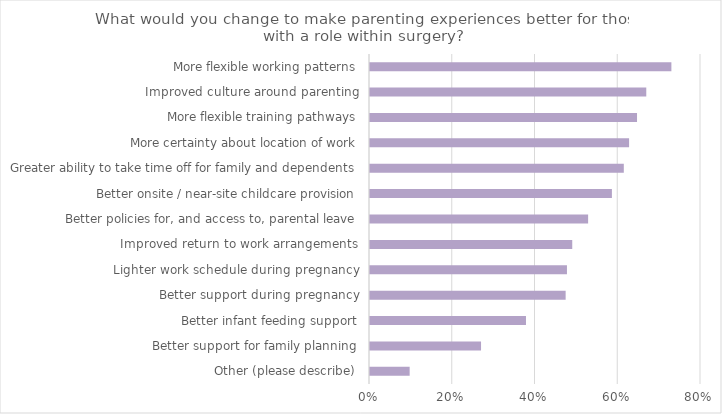
| Category | Series 0 |
|---|---|
| Other (please describe) | 0.096 |
| Better support for family planning | 0.268 |
| Better infant feeding support | 0.377 |
| Better support during pregnancy | 0.473 |
| Lighter work schedule during pregnancy | 0.476 |
| Improved return to work arrangements | 0.489 |
| Better policies for, and access to, parental leave | 0.527 |
| Better onsite / near-site childcare provision | 0.585 |
| Greater ability to take time off for family and dependents | 0.613 |
| More certainty about location of work | 0.626 |
| More flexible training pathways | 0.645 |
| Improved culture around parenting | 0.668 |
| More flexible working patterns | 0.728 |